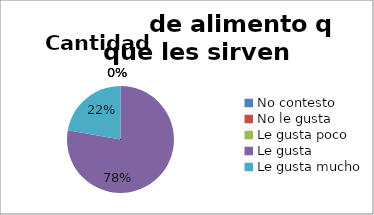
| Category | Series 0 |
|---|---|
| No contesto | 0 |
| No le gusta | 0 |
| Le gusta poco | 0 |
| Le gusta | 7 |
| Le gusta mucho | 2 |